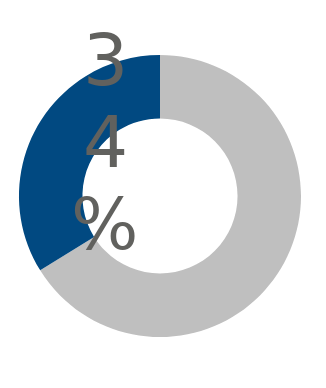
| Category | Series 0 |
|---|---|
| 0 | 0.662 |
| 1 | 0.338 |